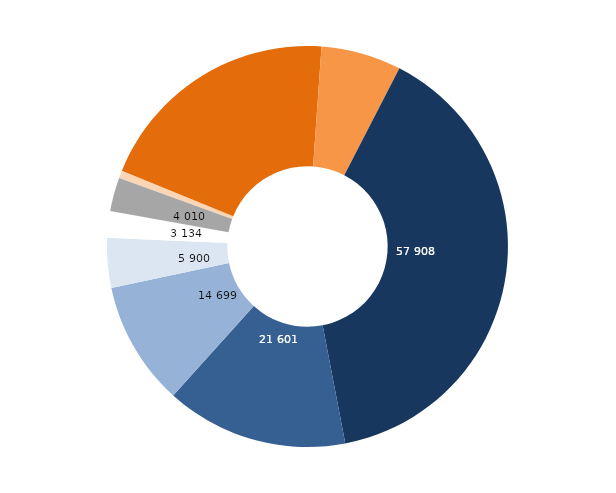
| Category | Series 0 |
|---|---|
| 0 | 912 |
| 1 | 29304 |
| 2 | 9501 |
| 3 | 57908.296 |
| 4 | 21600.69 |
| 5 | 14699.296 |
| 6 | 5899.598 |
| 7 | 3133.77 |
| 8 | 4010.43 |